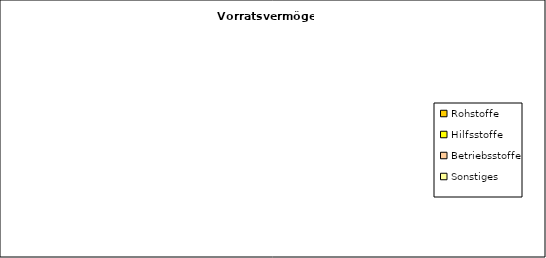
| Category | Series 0 |
|---|---|
| Rohstoffe | 0 |
| Hilfsstoffe | 0 |
| Betriebsstoffe | 0 |
| Sonstiges | 0 |